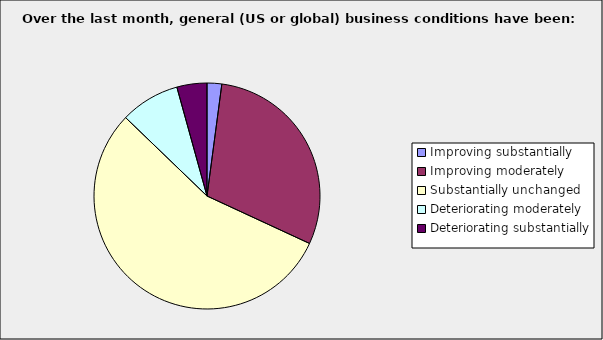
| Category | Series 0 |
|---|---|
| Improving substantially | 0.021 |
| Improving moderately | 0.298 |
| Substantially unchanged | 0.553 |
| Deteriorating moderately | 0.085 |
| Deteriorating substantially | 0.043 |